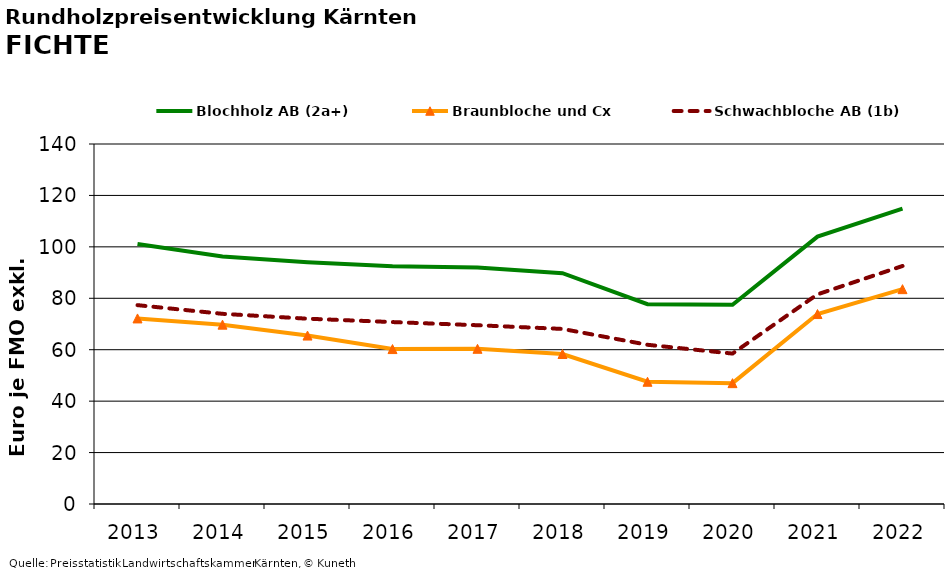
| Category | Blochholz AB (2a+) | Braunbloche und Cx | Schwachbloche AB (1b) |
|---|---|---|---|
| 2013.0 | 101.086 | 72.167 | 77.333 |
| 2014.0 | 96.258 | 69.75 | 73.958 |
| 2015.0 | 94.029 | 65.5 | 72.062 |
| 2016.0 | 92.433 | 60.25 | 70.75 |
| 2017.0 | 91.951 | 60.354 | 69.521 |
| 2018.0 | 89.753 | 58.333 | 68.083 |
| 2019.0 | 77.726 | 47.542 | 61.917 |
| 2020.0 | 77.463 | 47 | 58.5 |
| 2021.0 | 103.982 | 73.875 | 81.542 |
| 2022.0 | 114.894 | 83.556 | 92.556 |